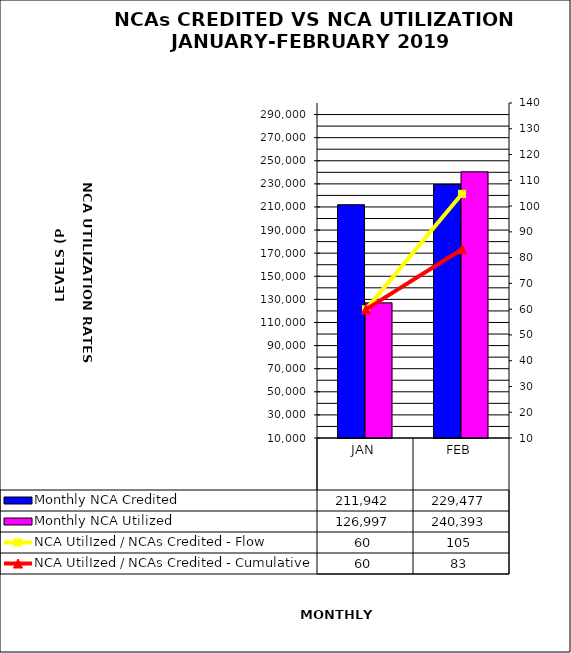
| Category | Monthly NCA Credited | Monthly NCA Utilized |
|---|---|---|
| JAN | 211942.048 | 126996.966 |
| FEB | 229477.028 | 240393.27 |